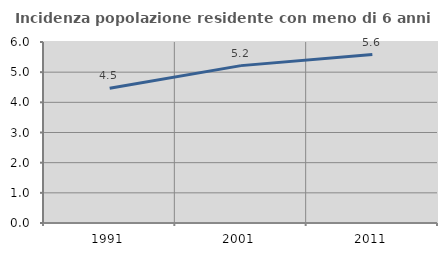
| Category | Incidenza popolazione residente con meno di 6 anni |
|---|---|
| 1991.0 | 4.466 |
| 2001.0 | 5.217 |
| 2011.0 | 5.585 |